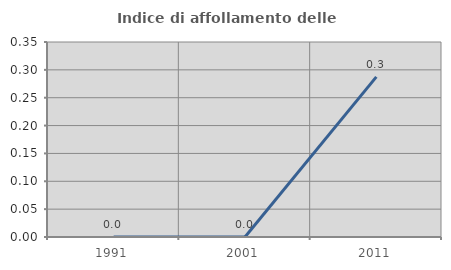
| Category | Indice di affollamento delle abitazioni  |
|---|---|
| 1991.0 | 0 |
| 2001.0 | 0 |
| 2011.0 | 0.287 |